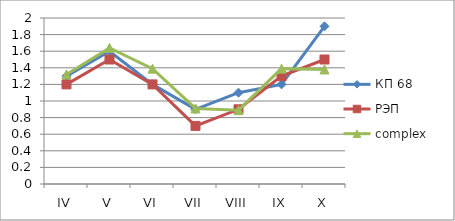
| Category | КП 68 | РЭП  | complex |
|---|---|---|---|
| IV | 1.3 | 1.2 | 1.32 |
| V | 1.6 | 1.5 | 1.64 |
| VI | 1.2 | 1.2 | 1.39 |
| VII | 0.9 | 0.7 | 0.91 |
| VIII | 1.1 | 0.9 | 0.89 |
| IX | 1.2 | 1.3 | 1.39 |
| X | 1.9 | 1.5 | 1.38 |